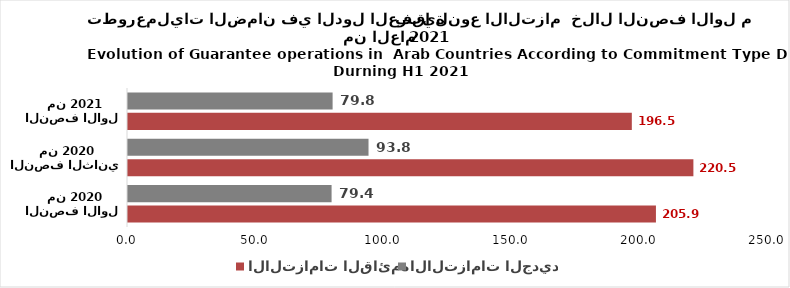
| Category | الالتزامات القائمة | الالتزامات الجديدة |
|---|---|---|
| النصف الاول
 من 2020 | 205.904 | 79.403 |
| النصف الثاني
 من 2020 | 220.511 | 93.808 |
| النصف الاول
 من 2021 | 196.5 | 79.8 |